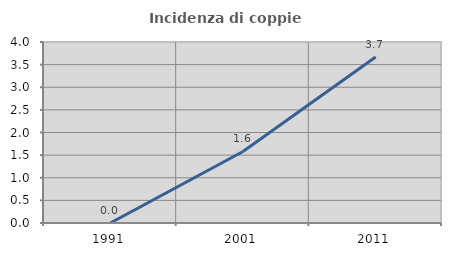
| Category | Incidenza di coppie miste |
|---|---|
| 1991.0 | 0 |
| 2001.0 | 1.581 |
| 2011.0 | 3.67 |